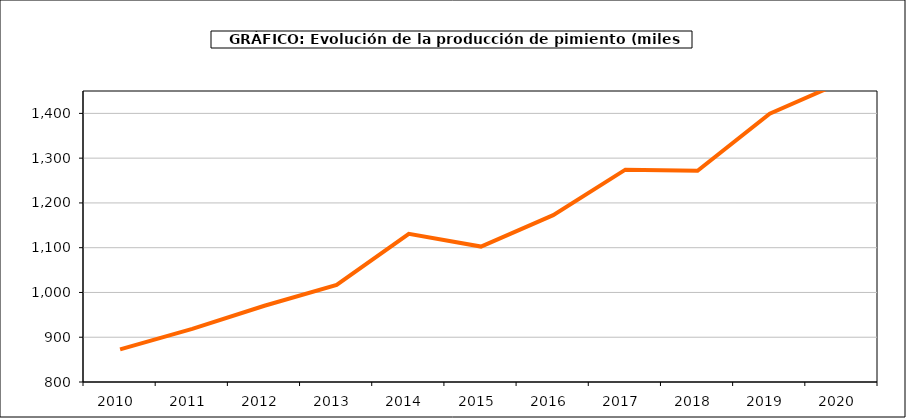
| Category | producción |
|---|---|
| 2010.0 | 873.011 |
| 2011.0 | 918.549 |
| 2012.0 | 970.296 |
| 2013.0 | 1016.811 |
| 2014.0 | 1130.863 |
| 2015.0 | 1102.522 |
| 2016.0 | 1172.639 |
| 2017.0 | 1274.264 |
| 2018.0 | 1271.721 |
| 2019.0 | 1399.192 |
| 2020.0 | 1469.969 |